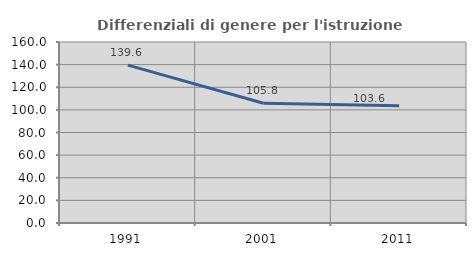
| Category | Differenziali di genere per l'istruzione superiore |
|---|---|
| 1991.0 | 139.571 |
| 2001.0 | 105.82 |
| 2011.0 | 103.586 |